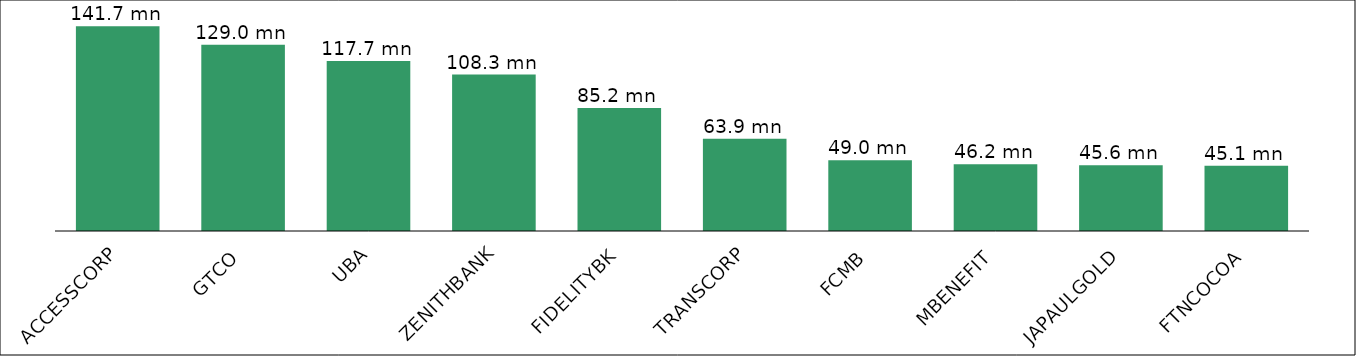
| Category | Series 0 |
|---|---|
| ACCESSCORP | 141748828 |
| GTCO | 128974439 |
| UBA | 117712666 |
| ZENITHBANK | 108340483 |
| FIDELITYBK | 85207686 |
| TRANSCORP | 63892761 |
| FCMB | 48968207 |
| MBENEFIT | 46172232 |
| JAPAULGOLD | 45563253 |
| FTNCOCOA | 45129099 |